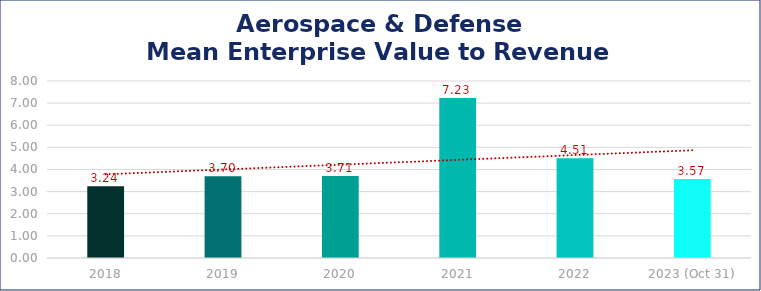
| Category | Aerospace & Defense |
|---|---|
| 2018 | 3.24 |
| 2019 | 3.7 |
| 2020 | 3.71 |
| 2021 | 7.23 |
| 2022 | 4.51 |
| 2023 (Oct 31) | 3.57 |